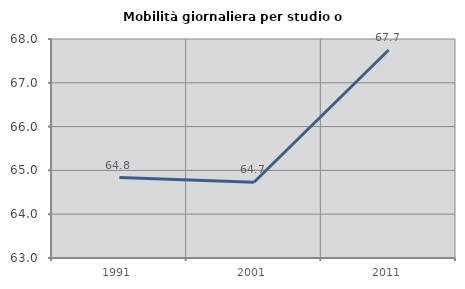
| Category | Mobilità giornaliera per studio o lavoro |
|---|---|
| 1991.0 | 64.836 |
| 2001.0 | 64.729 |
| 2011.0 | 67.75 |